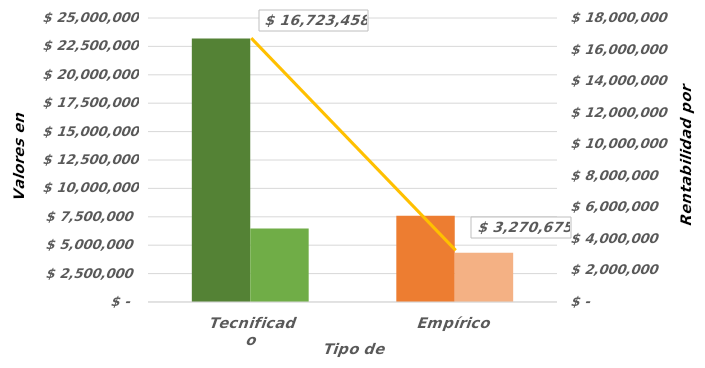
| Category | Ingresos por Ventas | Costos de Producción |
|---|---|---|
| Tecnificado | 23200000 | 6476541.667 |
| Empírico | 7600000 | 4329325 |